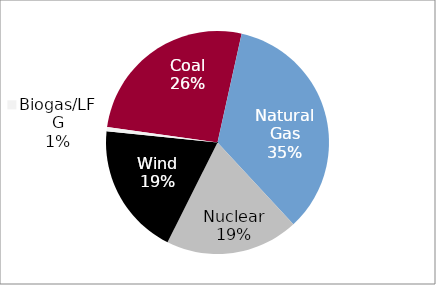
| Category | Owned and Unit-Contingent PPA Generation Capacity |
|---|---|
| Coal | 0.263 |
| Natural Gas | 0.346 |
| Nuclear | 0.193 |
| Wind | 0.192 |
| Biogas/LFG | 0.006 |